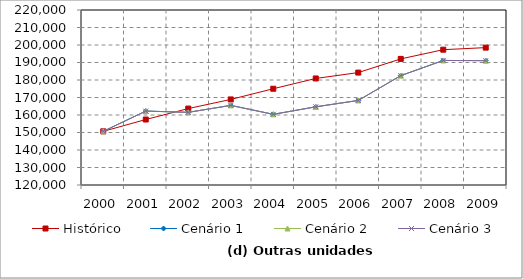
| Category | Histórico | Cenário 1 | Cenário 2 | Cenário 3 |
|---|---|---|---|---|
| 2000.0 | 150653 | 150653 | 150653 | 150653 |
| 2001.0 | 157415.585 | 162237.591 | 162237.591 | 162237.591 |
| 2002.0 | 163670.29 | 161522.124 | 161522.124 | 161522.124 |
| 2003.0 | 168894.234 | 165487.529 | 165487.529 | 165487.529 |
| 2004.0 | 175008.702 | 160387.026 | 160387.026 | 160387.026 |
| 2005.0 | 180880.041 | 164671.492 | 164671.492 | 164671.492 |
| 2006.0 | 184232.825 | 168308.209 | 168308.209 | 168308.209 |
| 2007.0 | 192046.843 | 182499.425 | 182499.425 | 182499.425 |
| 2008.0 | 197323.946 | 191162.612 | 191162.612 | 191162.612 |
| 2009.0 | 198501.755 | 191058.18 | 191058.18 | 191058.18 |